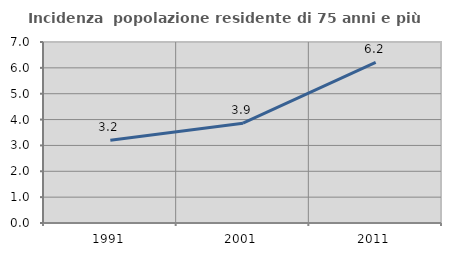
| Category | Incidenza  popolazione residente di 75 anni e più |
|---|---|
| 1991.0 | 3.198 |
| 2001.0 | 3.862 |
| 2011.0 | 6.211 |